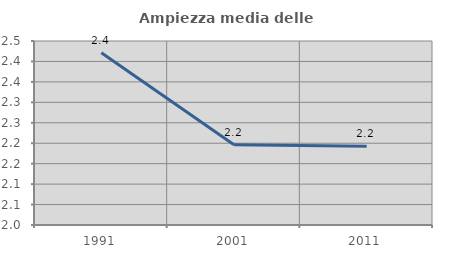
| Category | Ampiezza media delle famiglie |
|---|---|
| 1991.0 | 2.421 |
| 2001.0 | 2.196 |
| 2011.0 | 2.192 |